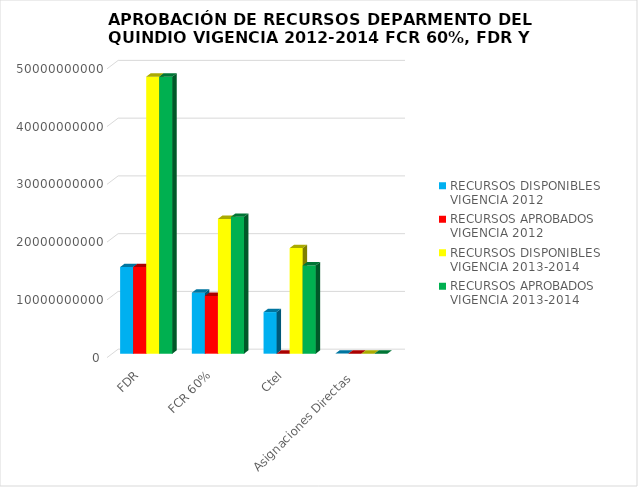
| Category | RECURSOS DISPONIBLES VIGENCIA 2012  | RECURSOS APROBADOS VIGENCIA 2012 | RECURSOS DISPONIBLES VIGENCIA 2013-2014 | RECURSOS APROBADOS VIGENCIA 2013-2014 |
|---|---|---|---|---|
| FDR | 15002814726.332 | 15002814726.332 | 47961789887.354 | 47961789287 |
| FCR 60% | 10564981702 | 10000000000 | 23339221563.051 | 23699221563 |
| CteI | 7203086182.825 | 0 | 18282421543.126 | 15283020000 |
| Asignaciones Directas  | 11208437 | 0 | 4458903.262 | 4458903 |